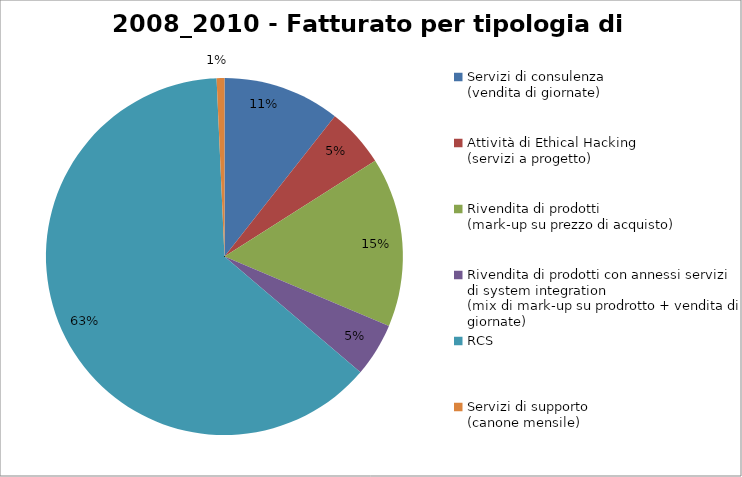
| Category | Tipologia di Servizi |
|---|---|
| Servizi di consulenza
(vendita di giornate) | 0.106 |
| Attività di Ethical Hacking
(servizi a progetto) | 0.054 |
| Rivendita di prodotti 
(mark-up su prezzo di acquisto) | 0.154 |
| Rivendita di prodotti con annessi servizi di system integration
(mix di mark-up su prodrotto + vendita di giornate) | 0.049 |
| RCS | 0.631 |
| Servizi di supporto
(canone mensile) | 0.007 |